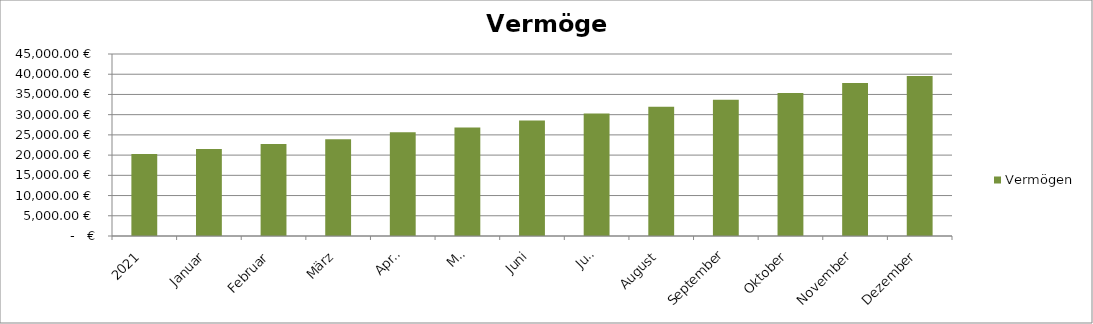
| Category | Vermögen |
|---|---|
| 2021 | 20300 |
| Januar | 21522.52 |
| Februar | 22725.04 |
| März | 23927.56 |
| April | 25636.08 |
| Mai | 26844.6 |
| Juni | 28553.12 |
| Juli | 30261.64 |
| August | 31970.16 |
| September | 33678.68 |
| Oktober | 35387.2 |
| November | 37845.72 |
| Dezember | 39554.24 |